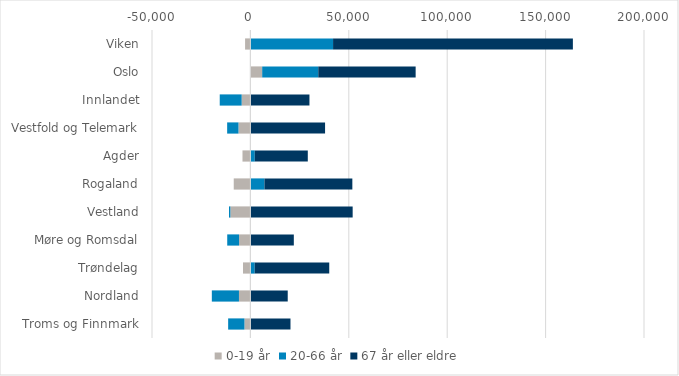
| Category | 0-19 år | 20-66 år | 67 år eller eldre |
|---|---|---|---|
| Viken | -2703 | 42009 | 121855 |
| Oslo | 5994 | 28496 | 49477 |
| Innlandet | -4445 | -11139 | 30008 |
| Vestfold og Telemark | -6061 | -5752 | 37942 |
| Agder | -4023 | 2212 | 26953 |
| Rogaland | -8466 | 7140 | 44662 |
| Vestland | -10184 | -705 | 51962 |
| Møre og Romsdal | -5771 | -6002 | 22065 |
| Trøndelag | -3771 | 2179 | 37889 |
| Nordland | -5813 | -13790 | 18968 |
| Troms og Finnmark | -3032 | -8275 | 20368 |